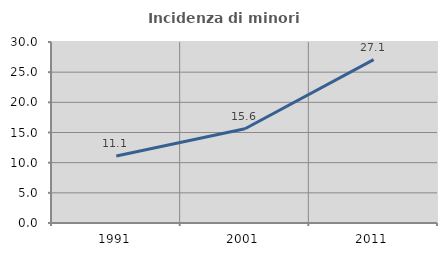
| Category | Incidenza di minori stranieri |
|---|---|
| 1991.0 | 11.111 |
| 2001.0 | 15.625 |
| 2011.0 | 27.083 |